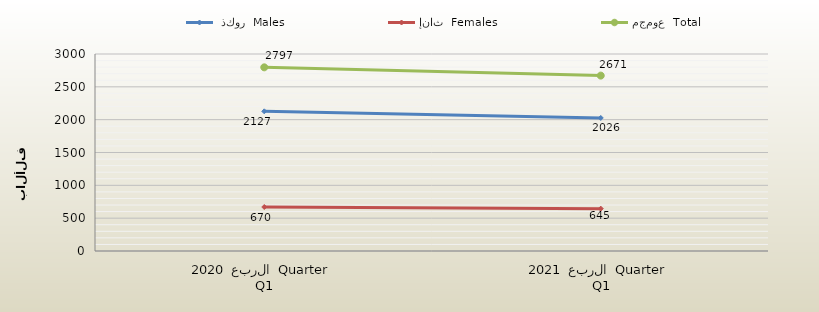
| Category |  ذكور  Males | إناث  Females | مجموع  Total |
|---|---|---|---|
| 0 | 2127 | 670 | 2797 |
| 1 | 2026 | 645 | 2671 |